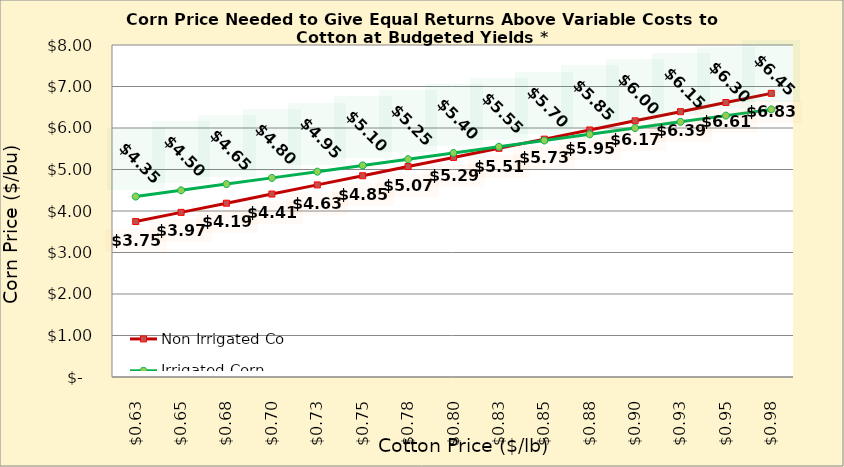
| Category | Non Irrigated Corn | Irrigated Corn |
|---|---|---|
| 0.6249999999999999 | 3.747 | 4.348 |
| 0.6499999999999999 | 3.967 | 4.498 |
| 0.6749999999999999 | 4.188 | 4.648 |
| 0.7 | 4.408 | 4.798 |
| 0.725 | 4.629 | 4.948 |
| 0.75 | 4.849 | 5.098 |
| 0.775 | 5.07 | 5.248 |
| 0.8 | 5.291 | 5.398 |
| 0.8250000000000001 | 5.511 | 5.548 |
| 0.8500000000000001 | 5.732 | 5.698 |
| 0.8750000000000001 | 5.952 | 5.848 |
| 0.9000000000000001 | 6.173 | 5.998 |
| 0.9250000000000002 | 6.394 | 6.148 |
| 0.9500000000000002 | 6.614 | 6.298 |
| 0.9750000000000002 | 6.835 | 6.448 |